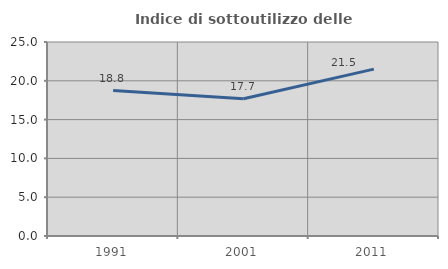
| Category | Indice di sottoutilizzo delle abitazioni  |
|---|---|
| 1991.0 | 18.75 |
| 2001.0 | 17.676 |
| 2011.0 | 21.501 |